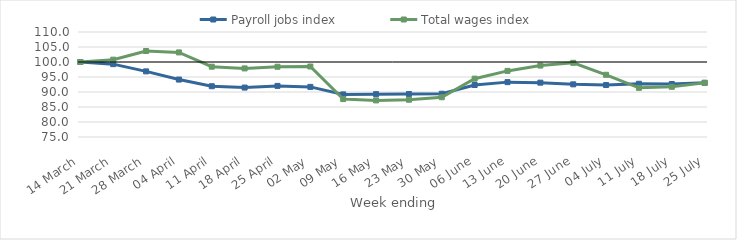
| Category | Payroll jobs index | Total wages index |
|---|---|---|
| 2020-03-14 | 100 | 100 |
| 2020-03-21 | 99.284 | 100.78 |
| 2020-03-28 | 96.88 | 103.662 |
| 2020-04-04 | 94.144 | 103.193 |
| 2020-04-11 | 91.924 | 98.428 |
| 2020-04-18 | 91.476 | 97.864 |
| 2020-04-25 | 92.04 | 98.414 |
| 2020-05-02 | 91.705 | 98.498 |
| 2020-05-09 | 89.2 | 87.639 |
| 2020-05-16 | 89.279 | 87.194 |
| 2020-05-23 | 89.335 | 87.419 |
| 2020-05-30 | 89.424 | 88.252 |
| 2020-06-06 | 92.335 | 94.445 |
| 2020-06-13 | 93.291 | 97.034 |
| 2020-06-20 | 93.114 | 98.814 |
| 2020-06-27 | 92.549 | 99.729 |
| 2020-07-04 | 92.321 | 95.735 |
| 2020-07-11 | 92.74 | 91.391 |
| 2020-07-18 | 92.668 | 91.734 |
| 2020-07-25 | 93.072 | 93.04 |